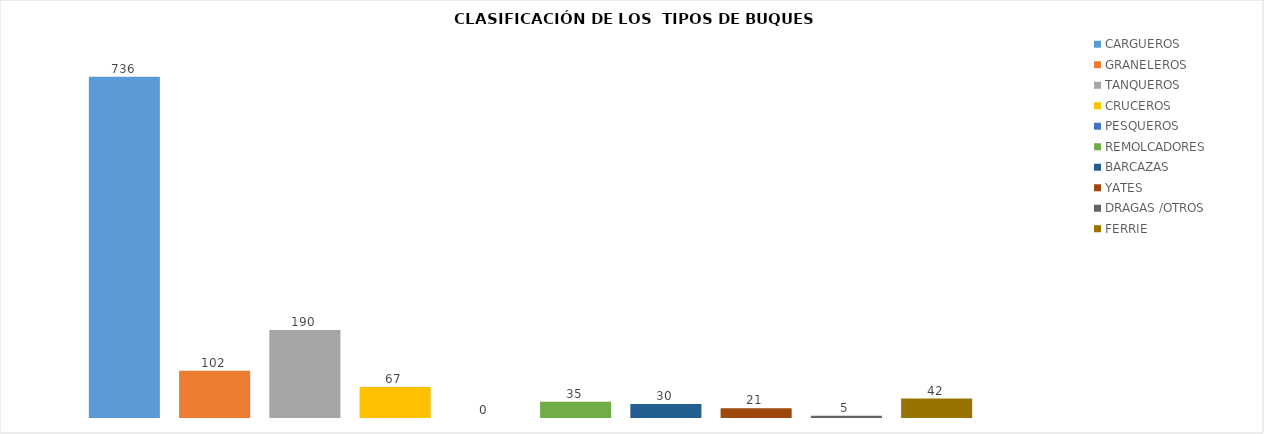
| Category | CARGUEROS | GRANELEROS | TANQUEROS | CRUCEROS | PESQUEROS | REMOLCADORES | BARCAZAS | YATES | DRAGAS /OTROS | FERRIE |
|---|---|---|---|---|---|---|---|---|---|---|
| 0 | 736 | 102 | 190 | 67 | 0 | 35 | 30 | 21 | 5 | 42 |